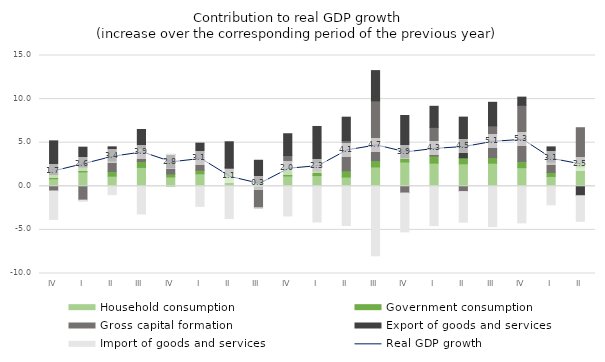
| Category | Household consumption | Government consumption | Gross capital formation | Export of goods and services | Import of goods and services |
|---|---|---|---|---|---|
| IV | 0.866 | 0.499 | -0.54 | 3.847 | -3.256 |
| I | 1.651 | 0.558 | -1.587 | 2.278 | -0.13 |
| II | 1.164 | 0.542 | 1.227 | 1.591 | -0.952 |
| III | 2.166 | 0.682 | 1.497 | 2.167 | -3.175 |
| IV | 1.072 | 0.343 | 0.728 | 1.501 | 0.049 |
| I | 1.437 | 0.407 | 1.437 | 1.669 | -2.3 |
| II | 1.076 | 0.364 | 0.696 | 2.969 | -3.697 |
| III | -0.096 | 0.377 | -2.377 | 2.609 | -0.011 |
| IV | 1.185 | 0.816 | 1.527 | 2.499 | -3.402 |
| I | 1.231 | 0.509 | 0.953 | 4.168 | -4.093 |
| II | 1.061 | 0.717 | 3.472 | 2.677 | -4.499 |
| III | 2.218 | 0.728 | 6.846 | 3.475 | -7.969 |
| IV | 2.79 | 0.475 | -0.773 | 4.855 | -4.452 |
| I | 2.655 | 0.821 | 3.288 | 2.411 | -4.512 |
| II | 2.581 | 0.686 | -0.605 | 4.667 | -3.508 |
| III | 2.651 | 0.642 | 3.638 | 2.702 | -4.626 |
| IV | 2.138 | 0.721 | 6.436 | 0.932 | -4.189 |
| I | 1.13 | 0.467 | 1.187 | 1.735 | -2.128 |
| II | 2.22 | 0.46 | 4.039 | -1.084 | -2.928 |